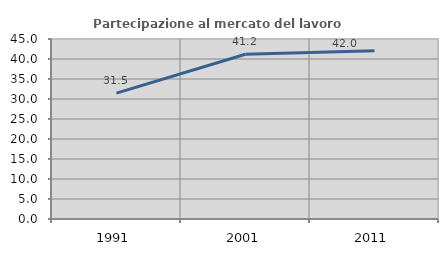
| Category | Partecipazione al mercato del lavoro  femminile |
|---|---|
| 1991.0 | 31.453 |
| 2001.0 | 41.173 |
| 2011.0 | 42.035 |